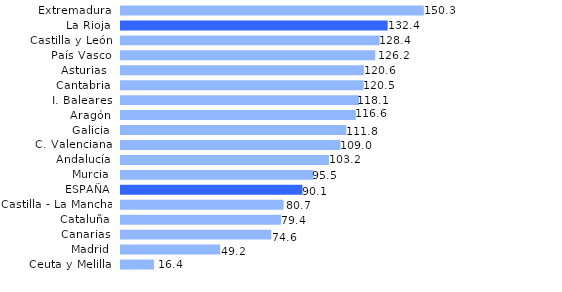
| Category | Series 0 |
|---|---|
| Ceuta y Melilla | 16.364 |
| Madrid | 49.247 |
| Canarias | 74.57 |
| Cataluña | 79.408 |
| Castilla - La Mancha | 80.691 |
| ESPAÑA | 90.071 |
| Murcia | 95.539 |
| Andalucía | 103.213 |
| C. Valenciana | 108.965 |
| Galicia | 111.847 |
| Aragón | 116.602 |
| I. Baleares | 118.084 |
| Cantabria | 120.465 |
| Asturias  | 120.585 |
| País Vasco | 126.218 |
| Castilla y León | 128.416 |
| La Rioja | 132.379 |
| Extremadura | 150.326 |